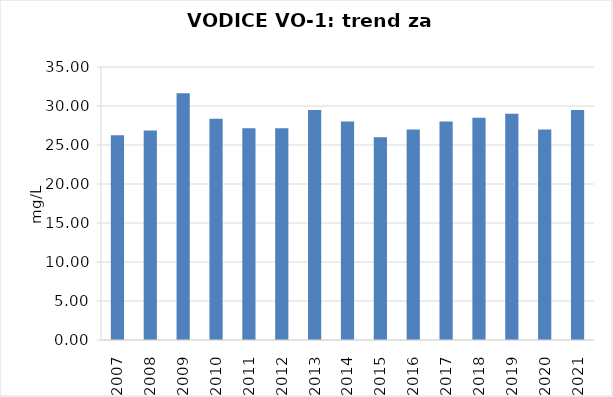
| Category | Vsota |
|---|---|
| 2007 | 26.25 |
| 2008 | 26.85 |
| 2009 | 31.65 |
| 2010 | 28.35 |
| 2011 | 27.15 |
| 2012 | 27.15 |
| 2013 | 29.5 |
| 2014 | 28 |
| 2015 | 26 |
| 2016 | 27 |
| 2017 | 28 |
| 2018 | 28.5 |
| 2019 | 29 |
| 2020 | 27 |
| 2021 | 29.5 |